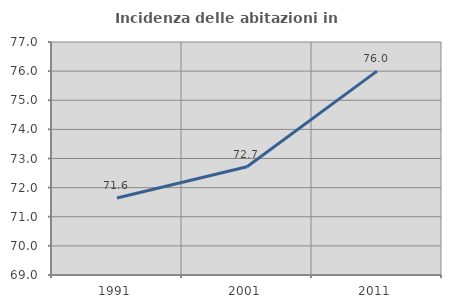
| Category | Incidenza delle abitazioni in proprietà  |
|---|---|
| 1991.0 | 71.645 |
| 2001.0 | 72.715 |
| 2011.0 | 76 |